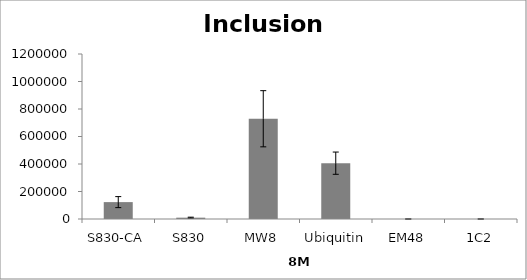
| Category | Series 0 |
|---|---|
| S830-CA | 122833.867 |
| S830 | 9724.405 |
| MW8 | 729092.121 |
| Ubiquitin | 405961.23 |
| EM48 | 0 |
| 1C2 | 0 |